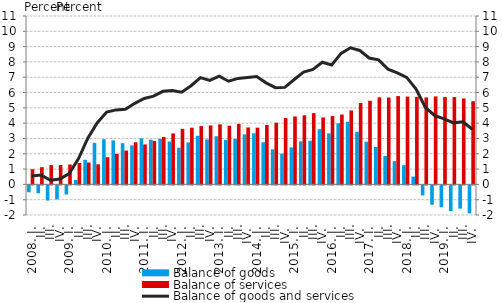
| Category | Balance of goods | Balance of services |
|---|---|---|
| 2008. I. | -0.45 | 0.991 |
|          II. | -0.517 | 1.126 |
|          III. | -0.987 | 1.26 |
|          IV. | -0.919 | 1.265 |
| 2009. I. | -0.594 | 1.303 |
|          II. | 0.29 | 1.392 |
|          III. | 1.61 | 1.429 |
|          IV. | 2.713 | 1.313 |
| 2010. I. | 2.948 | 1.778 |
|          II. | 2.87 | 1.996 |
|          III. | 2.691 | 2.211 |
|          IV. | 2.548 | 2.749 |
| 2011. I. | 3.006 | 2.608 |
|          II. | 2.919 | 2.842 |
|          III. | 2.981 | 3.098 |
|          IV. | 2.803 | 3.33 |
| 2012. I. | 2.395 | 3.628 |
|          II. | 2.741 | 3.704 |
|          III. | 3.17 | 3.807 |
|          IV. | 2.94 | 3.853 |
| 2013. I. | 3.144 | 3.922 |
| II. | 2.906 | 3.832 |
|          III. | 2.969 | 3.955 |
| IV. | 3.266 | 3.718 |
| 2014. I. | 3.337 | 3.706 |
| II. | 2.755 | 3.877 |
|          III. | 2.292 | 4.027 |
| IV. | 2.006 | 4.331 |
| 2015. I. | 2.414 | 4.438 |
| II. | 2.816 | 4.514 |
|          III. | 2.851 | 4.654 |
| IV. | 3.61 | 4.372 |
| 2016. I. | 3.333 | 4.466 |
| II. | 3.991 | 4.564 |
|          III. | 4.093 | 4.832 |
| IV. | 3.434 | 5.315 |
| 2017. I. | 2.793 | 5.463 |
| II. | 2.448 | 5.688 |
|          III. | 1.853 | 5.675 |
| IV. | 1.52 | 5.77 |
| 2018. I. | 1.254 | 5.735 |
| II. | 0.508 | 5.721 |
|          III. | -0.656 | 5.68 |
| IV. | -1.261 | 5.746 |
| 2019. I. | -1.428 | 5.709 |
| II. | -1.682 | 5.702 |
|          III. | -1.518 | 5.612 |
| IV. | -1.83 | 5.434 |